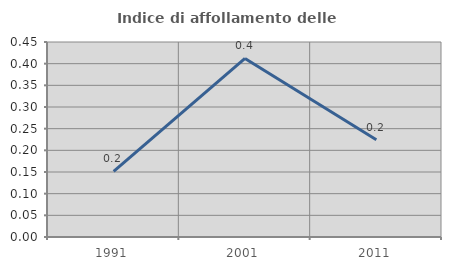
| Category | Indice di affollamento delle abitazioni  |
|---|---|
| 1991.0 | 0.151 |
| 2001.0 | 0.412 |
| 2011.0 | 0.224 |